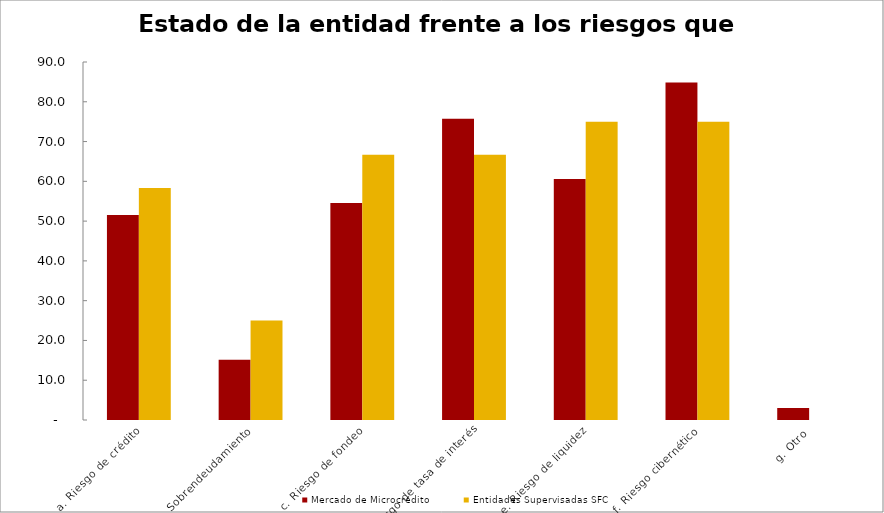
| Category | Mercado de Microcrédito | Entidades Supervisadas SFC |
|---|---|---|
| a. Riesgo de crédito | 51.515 | 58.333 |
| b. Sobrendeudamiento | 15.152 | 25 |
| c. Riesgo de fondeo | 54.545 | 66.667 |
| d. Riesgo de tasa de interés | 75.758 | 66.667 |
| e. Riesgo de liquidez | 60.606 | 75 |
| f. Riesgo cibernético | 84.848 | 75 |
| g. Otro | 3.03 | 0 |